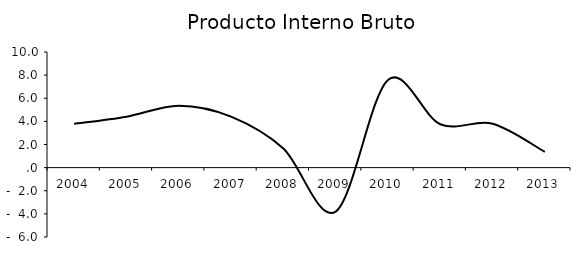
| Category |   3.8   4.4   5.4   4.4   1.7 -  3.8   7.6   3.8   3.8 |
|---|---|
| 2004.0 | 3.784 |
| 2005.0 | 4.409 |
| 2006.0 | 5.355 |
| 2007.0 | 4.41 |
| 2008.0 | 1.654 |
| 2009.0 | -3.807 |
| 2010.0 | 7.588 |
| 2011.0 | 3.754 |
| 2012.0 | 3.794 |
| 2013.0 | 1.358 |